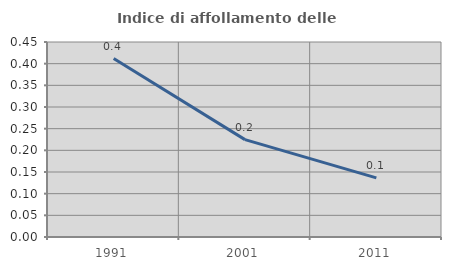
| Category | Indice di affollamento delle abitazioni  |
|---|---|
| 1991.0 | 0.412 |
| 2001.0 | 0.225 |
| 2011.0 | 0.137 |